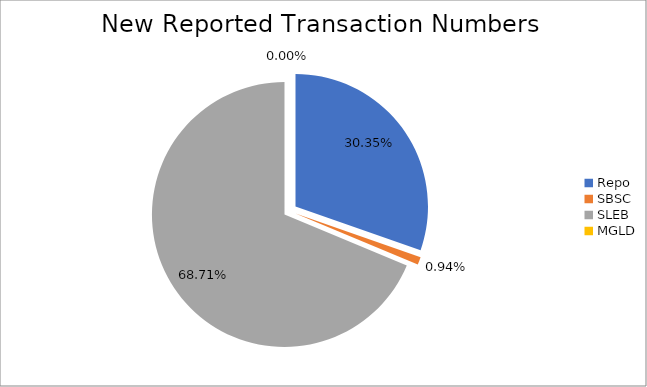
| Category | Series 0 |
|---|---|
| Repo | 325892 |
| SBSC | 10116 |
| SLEB | 737779 |
| MGLD | 18 |